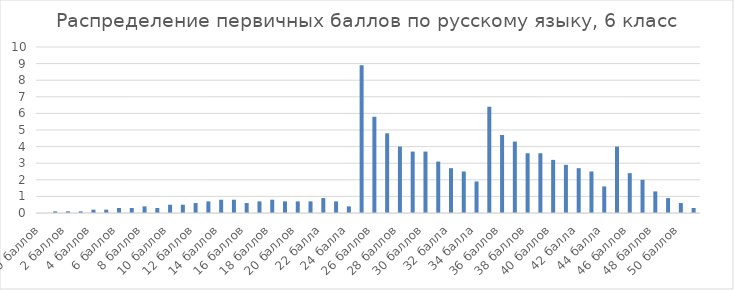
| Category | Series 0 |
|---|---|
| 0 баллов | 0 |
| 1 баллов | 0.1 |
| 2 баллов | 0.1 |
| 3 баллов | 0.1 |
| 4 баллов | 0.2 |
| 5 баллов | 0.2 |
| 6 баллов | 0.3 |
| 7 баллов | 0.3 |
| 8 баллов | 0.4 |
| 9 баллов | 0.3 |
| 10 баллов | 0.5 |
| 11 баллов | 0.5 |
| 12 баллов | 0.6 |
| 13 баллов | 0.7 |
| 14 баллов | 0.8 |
| 15 баллов | 0.8 |
| 16 баллов | 0.6 |
| 17 баллов | 0.7 |
| 18 баллов | 0.8 |
| 19 баллов | 0.7 |
| 20 баллов | 0.7 |
| 21 балл | 0.7 |
| 22 балла | 0.9 |
| 23 балла | 0.7 |
| 24 балла | 0.4 |
| 25 баллов | 8.9 |
| 26 баллов | 5.8 |
| 27 баллов | 4.8 |
| 28 баллов | 4 |
| 29 баллов | 3.7 |
| 30 баллов | 3.7 |
| 31 балла | 3.1 |
| 32 балла | 2.7 |
| 33 балла | 2.5 |
| 34 балла | 1.9 |
| 35 баллов | 6.4 |
| 36 баллов | 4.7 |
| 37 баллов | 4.3 |
| 38 баллов | 3.6 |
| 39 баллов | 3.6 |
| 40 баллов | 3.2 |
| 41 балл | 2.9 |
| 42 балла | 2.7 |
| 43 балла | 2.5 |
| 44 балла | 1.6 |
| 45 баллов | 4 |
| 46 баллов | 2.4 |
| 47 баллов | 2 |
| 48 баллов | 1.3 |
| 49 баллов | 0.9 |
| 50 баллов | 0.6 |
| 51 балл | 0.3 |